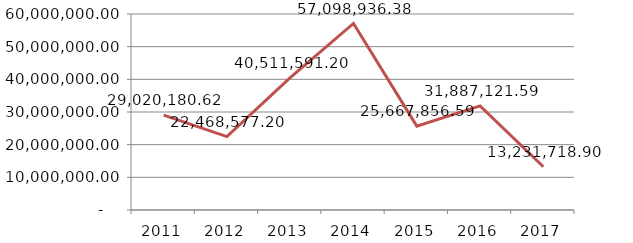
| Category | Total |
|---|---|
| 2011.0 | 29020180.616 |
| 2012.0 | 22468577.2 |
| 2013.0 | 40511591.2 |
| 2014.0 | 57098936.375 |
| 2015.0 | 25667856.59 |
| 2016.0 | 31887121.59 |
| 2017.0 | 13231718.9 |